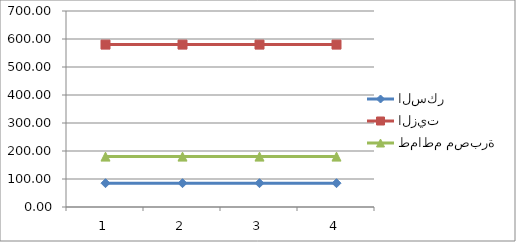
| Category | السكر | الزيت | طماطم مصبرة  |
|---|---|---|---|
| 0 | 85 | 580 | 180 |
| 1 | 85 | 580 | 180 |
| 2 | 85 | 580 | 180 |
| 3 | 85 | 580 | 180 |